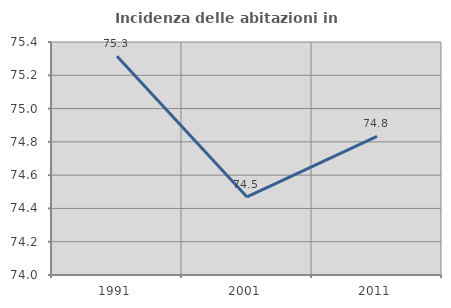
| Category | Incidenza delle abitazioni in proprietà  |
|---|---|
| 1991.0 | 75.314 |
| 2001.0 | 74.469 |
| 2011.0 | 74.833 |